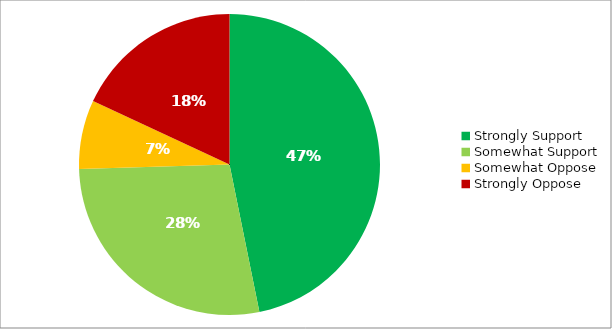
| Category | Responses |
|---|---|
| Strongly Support | 0.468 |
| Somewhat Support | 0.277 |
| Somewhat Oppose | 0.074 |
| Strongly Oppose | 0.181 |